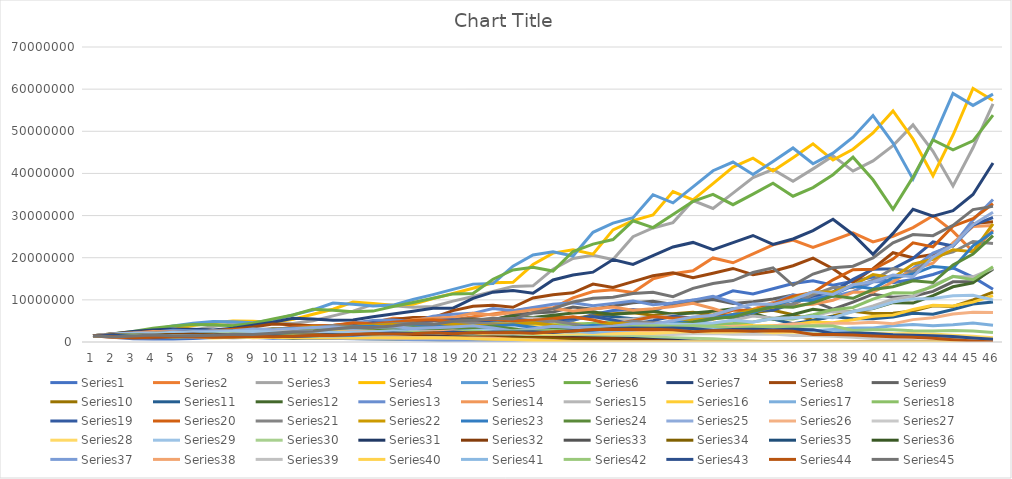
| Category | Series 0 | Series 1 | Series 2 | Series 3 | Series 4 | Series 5 | Series 6 | Series 7 | Series 8 | Series 9 | Series 10 | Series 11 | Series 12 | Series 13 | Series 14 | Series 15 | Series 16 | Series 17 | Series 18 | Series 19 | Series 20 | Series 21 | Series 22 | Series 23 | Series 24 | Series 25 | Series 26 | Series 27 | Series 28 | Series 29 | Series 30 | Series 31 | Series 32 | Series 33 | Series 34 | Series 35 | Series 36 | Series 37 | Series 38 | Series 39 | Series 40 | Series 41 | Series 42 | Series 43 | Series 44 |
|---|---|---|---|---|---|---|---|---|---|---|---|---|---|---|---|---|---|---|---|---|---|---|---|---|---|---|---|---|---|---|---|---|---|---|---|---|---|---|---|---|---|---|---|---|---|
| 0 | 1500000 | 1500000 | 1500000 | 1500000 | 1500000 | 1500000 | 1500000 | 1500000 | 1500000 | 1500000 | 1500000 | 1500000 | 1500000 | 1500000 | 1500000 | 1500000 | 1500000 | 1500000 | 1500000 | 1500000 | 1500000 | 1500000 | 1500000 | 1500000 | 1500000 | 1500000 | 1500000 | 1500000 | 1500000 | 1500000 | 1500000 | 1500000 | 1500000 | 1500000 | 1500000 | 1500000 | 1500000 | 1500000 | 1500000 | 1500000 | 1500000 | 1500000 | 1500000 | 1500000 | 1500000 |
| 1 | 1134576 | 1059408 | 1413792 | 1538352 | 1732752 | 1948752 | 1891152 | 1949904 | 1715184 | 1588464 | 1442304 | 1383696 | 1679328 | 1798272 | 1718928 | 1773072 | 1405296 | 1390032 | 1495440 | 1677600 | 1622736 | 1617408 | 1598256 | 1466928 | 1884384 | 1663776 | 1503792 | 1378080 | 1849968 | 1567584 | 1514448 | 1713168 | 1365552 | 1611648 | 1596240 | 1518336 | 1344816 | 1557504 | 1553904 | 1327248 | 1532160 | 1567872 | 1598256 | 1269648 | 1184688 |
| 2 | 794508.387 | 987287.105 | 1449584.234 | 1776388.918 | 2261662.356 | 2479684.665 | 2476535.729 | 2252513.849 | 1826694.554 | 1530477.456 | 1325306.334 | 1536051.606 | 2017744.064 | 2073802.851 | 2040958.206 | 1666823.842 | 1290280.17 | 1376446.944 | 1672966.006 | 1822139.791 | 1749967.989 | 1727049.266 | 1566522.589 | 1840861.535 | 2108086.916 | 1673867.708 | 1379790.25 | 1691233.685 | 1947899.026 | 1584606.081 | 1729592.481 | 1567017.136 | 1460341.336 | 1719151.204 | 1618808.615 | 1360250.523 | 1387857.559 | 1613190.749 | 1373910.508 | 1344624.73 | 1600083.429 | 1671407.992 | 1353012.157 | 989720.537 | 1401017.204 |
| 3 | 731928.376 | 1000209.173 | 1673453.928 | 2317818.884 | 2888597.417 | 3272597.959 | 2877176.102 | 2420747.775 | 1769876.652 | 1409596.472 | 1463986.809 | 1830147.983 | 2331441.271 | 2476678.746 | 1926809.735 | 1537117.374 | 1263199.189 | 1529016.345 | 1817581.082 | 1973149.612 | 1868823.93 | 1696319.77 | 1970548.273 | 2057585.835 | 2138039.289 | 1541647.755 | 1690784.846 | 1773300.256 | 1983936.333 | 1812007.674 | 1581975.948 | 1685006.137 | 1550592.718 | 1747584.272 | 1453166.883 | 1402540.621 | 1428253.316 | 1426063.673 | 1390582.86 | 1391917.285 | 1704207.187 | 1415672.224 | 1054917.65 | 1147894.731 | 1642870.576 |
| 4 | 732278.317 | 1140017.458 | 2182991.184 | 2959507.087 | 3824133.077 | 3824616.197 | 3107428.082 | 2366091.785 | 1640429.284 | 1561699.374 | 1735647.634 | 2099082.258 | 2789324.759 | 2350966.008 | 1786447.627 | 1513033.61 | 1386356.218 | 1650159.668 | 1968742.399 | 2115736.072 | 1835791.76 | 2138591.033 | 2206859.983 | 2085103.514 | 1986028.237 | 1897475.205 | 1770546.885 | 1798545.884 | 2286351.073 | 1659281.783 | 1701011.386 | 1798816.138 | 1569049.318 | 1572680.535 | 1501949.845 | 1442005.836 | 1253920.593 | 1443029.835 | 1438017.564 | 1468976.07 | 1442101.117 | 1104563.443 | 1223884.403 | 1321175.211 | 1500392.893 |
| 5 | 823291.224 | 1469507.211 | 2786824.661 | 3917113.781 | 4479676.461 | 4151864.04 | 3051690.005 | 2214554.063 | 1831965.663 | 1857005.448 | 1981899.664 | 2494332.524 | 2652135.977 | 2194682.47 | 1770069.844 | 1670185.637 | 1478907.695 | 1775099.474 | 2111565.254 | 2086583.548 | 2314720.646 | 2399423.1 | 2240471.214 | 1935181.665 | 2468602.876 | 1994481.839 | 1793430.266 | 2063774.169 | 2108504.869 | 1786518.257 | 1815819.017 | 1829986.154 | 1405210.522 | 1630323.188 | 1548145.318 | 1264711.854 | 1257809.365 | 1491873.169 | 1515996.113 | 1231165.793 | 1123726.108 | 1282867.973 | 1409055.369 | 1184991.941 | 1496612.819 |
| 6 | 1047426.927 | 1858057.316 | 3687976.111 | 4587807.597 | 4872748.766 | 4097170.425 | 2871146.199 | 2503154.594 | 2195727.108 | 2126117.803 | 2345427.511 | 2356611.036 | 2480942.408 | 2192627.745 | 1967529.616 | 1791687.9 | 1571473.734 | 1890986.01 | 2083001.658 | 2641956.31 | 2597302.884 | 2440102.648 | 2083376.771 | 2403022.354 | 2616410.052 | 2027895.648 | 2055150.047 | 1895807.469 | 2288575.698 | 1909586.415 | 1847199.971 | 1648178.675 | 1448311.324 | 1685744.391 | 1361520.003 | 1266988.89 | 1288006.366 | 1572350.467 | 1269125.777 | 946529.586 | 1302570.562 | 1478521.387 | 1264184.787 | 1155190.612 | 1598985.153 |
| 7 | 1310156.705 | 2439156.728 | 4318924.885 | 4989635.022 | 4817642.689 | 3875116.406 | 3265911.755 | 3035774.071 | 2531628.424 | 2522321.084 | 2207324.202 | 2187025.472 | 2484742.186 | 2458260.961 | 2124708.304 | 1915190.834 | 1653585.835 | 1853064.931 | 2638128.43 | 2974554.118 | 2641591.104 | 2273039.288 | 2592730.407 | 2544798.327 | 2682172.245 | 2332896.437 | 1885581.886 | 2048579.887 | 2465401.835 | 1945085.645 | 1663603.172 | 1710247.783 | 1488423.768 | 1487508.591 | 1368745.795 | 1295543.853 | 1343763.993 | 1315928.753 | 974134.943 | 1074677.761 | 1498360.969 | 1327887.164 | 1232860.905 | 1200249.833 | 1837116.249 |
| 8 | 1704107.847 | 2839060.946 | 4696726.24 | 4932527.346 | 4565839.1 | 4435891.098 | 3984945.686 | 3536205.57 | 3022869.654 | 2379368.097 | 2038426.47 | 2169491.742 | 2792834.698 | 2676199.24 | 2287028.464 | 2027398.661 | 1600680.451 | 2330490.552 | 2970888.037 | 3034786.65 | 2460979.549 | 2834480.165 | 2750734.027 | 2606641.798 | 3111511.904 | 2148003.17 | 2034689.17 | 2197415.557 | 2530446.295 | 1754121.993 | 1726155.476 | 1770186.926 | 1304816.99 | 1501775.655 | 1405005.964 | 1349543.087 | 1112431.666 | 1009650.569 | 1103215.254 | 1210898.483 | 1343171.36 | 1296726.486 | 1281557.526 | 1334757.954 | 1776543.518 |
| 9 | 1969458.961 | 3071239.672 | 4642529.715 | 4674024.664 | 5239286.091 | 5445050.545 | 4665967.861 | 4261718.214 | 2868922.417 | 2203836.785 | 2009966.954 | 2414439.034 | 3047618.262 | 2904835.21 | 2437866.741 | 1974378.239 | 1986632.268 | 2609506.562 | 3031652.486 | 2836540.45 | 3069191.422 | 3012268.28 | 2822655.389 | 3021405.921 | 2886543.778 | 2327237.305 | 2179563.852 | 2245996.44 | 2300159.703 | 1822993.428 | 1786546.219 | 1563714.157 | 1306388.484 | 1548758.162 | 1469634.096 | 1115345.233 | 840210.38 | 1142709.595 | 1239830.204 | 1063070.907 | 1308453.58 | 1350201.602 | 1425991.771 | 1247031.036 | 2066432.898 |
| 10 | 2117388.207 | 3020799.477 | 4398774.294 | 5362480.862 | 6445917.945 | 6407957.174 | 5649351.298 | 4079559.202 | 2677613.079 | 2180976.682 | 2222810.609 | 2610322.444 | 3315979.689 | 3121925.187 | 2390454.44 | 2466497.417 | 2200249.025 | 2648814.161 | 2834198.597 | 3550671.606 | 3262009.812 | 3096108.81 | 3277746.752 | 2800896.7 | 3154026.5 | 2502696.11 | 2224802.517 | 2032791.955 | 2412837.232 | 1889933.831 | 1578065.848 | 1580872.834 | 1334949.844 | 1628036.428 | 1220047.78 | 840346.453 | 927244.555 | 1283377.442 | 1085557.611 | 1007253.046 | 1358275.007 | 1505392.791 | 1333099.789 | 1390757.223 | 2403728.552 |
| 11 | 2070366.16 | 2846864.509 | 5046072.256 | 6596391.967 | 7600349.012 | 7793273.344 | 5430789.992 | 3848101.439 | 2674394.648 | 2421182.771 | 2388722.734 | 2813110.502 | 3572156.63 | 3085782.384 | 3008310.427 | 2746623.903 | 2210448.325 | 2462663.26 | 3548569.82 | 3785290.733 | 3353111.053 | 3601242.503 | 3043459.957 | 3057931.831 | 3419407.147 | 2564394.853 | 2010835.52 | 2121604.982 | 2525653.441 | 1672358.129 | 1595255.198 | 1632760.125 | 1389603.341 | 1358742.615 | 925260.726 | 923660.193 | 1014078.596 | 1122927.05 | 1024797.782 | 1008857.299 | 1508863.571 | 1410410.544 | 1487921.941 | 1552240.16 | 2520993.129 |
| 12 | 1938579.205 | 3244865.379 | 6206467.558 | 7776694.249 | 9258993.05 | 7522192.878 | 5149094.992 | 3892102.505 | 2997571.421 | 2611433.122 | 2558131.709 | 3002198.633 | 3538790.722 | 3916254.851 | 3370288.835 | 2773630.33 | 2032750.533 | 3064143.712 | 3783778.871 | 3902604.195 | 3900537.205 | 3348753.373 | 3328781.627 | 3312647.005 | 3531182.925 | 2326960.426 | 2095281.842 | 2209254.904 | 2257597.519 | 1694360.301 | 1647472.115 | 1719039.412 | 1147565.372 | 1038361.371 | 1027922.338 | 1005744.256 | 862533.185 | 1059092.705 | 1021415.508 | 1071433.249 | 1408030.544 | 1578569.317 | 1662031.841 | 1562926.006 | 3071998.71 |
| 13 | 2192335.38 | 3966913.663 | 7316299.883 | 9472671.334 | 8950463.106 | 7166963.725 | 5239303.688 | 4418595.884 | 3262487.639 | 2807382.127 | 2713054.748 | 2947233.995 | 4501790.849 | 4417600.599 | 3422771.031 | 2564710.303 | 2497497.255 | 3250343.019 | 3901774.936 | 4553307.198 | 3627362.901 | 3668700.505 | 3612255.055 | 3418383.899 | 3230033.549 | 2435988.02 | 2178170.749 | 1964054.463 | 2316195.64 | 1754073.712 | 1734370.751 | 1437098.333 | 863640.612 | 1167835.06 | 1132242.937 | 851333.875 | 781419.443 | 1054282.038 | 1077801.927 | 949473.205 | 1567959.737 | 1768266.18 | 1674864.92 | 1821997.125 | 3479330.448 |
| 14 | 2660131.01 | 4652458.789 | 8911124.125 | 9156020.762 | 8543267.888 | 7333745.289 | 5983774.194 | 4866181.731 | 3540282.958 | 2988790.304 | 2646998.946 | 3713582.012 | 5087727.304 | 4514893.759 | 3183899.399 | 3171245.084 | 2621219.847 | 3334791.503 | 4553190.434 | 4245608.693 | 3974293.174 | 3987284.134 | 3733682.89 | 3124479.648 | 3412977.755 | 2544563.311 | 1932991.1 | 2001521.803 | 2430210.875 | 1851315.054 | 1449774.613 | 1100874.829 | 947483.427 | 1303102.483 | 970542.54 | 765795.169 | 734902.219 | 1110646.148 | 947667.397 | 985982.461 | 1747327.121 | 1787066.933 | 1954330.198 | 1981871.262 | 3417244.161 |
| 15 | 3099952.258 | 5641173.821 | 8612594.826 | 8738331.118 | 8760250.731 | 8422559.892 | 6625765.841 | 5344069.55 | 3803890.816 | 2927051.046 | 3313369.929 | 4164618.321 | 5208832.81 | 4227559.866 | 3963906.024 | 3346392.772 | 2661113.942 | 3871825.775 | 4246199.591 | 4665306.67 | 4319787.148 | 4127402.284 | 3418382.864 | 3298559.638 | 3599067.881 | 2269556.993 | 1965522.102 | 2085092.374 | 2600794.171 | 1551726.48 | 1110431.757 | 1242851.396 | 1029571.681 | 1132484.674 | 889271.863 | 712569.813 | 714112.416 | 974569.815 | 972995.019 | 1017073.397 | 1756572.359 | 2092052.106 | 2127719.477 | 1870009.751 | 3800679.18 |
| 16 | 3737379.098 | 5430079.906 | 8218953.227 | 8958929.321 | 10081343.223 | 9372822.188 | 7315902.692 | 5808457.832 | 3758924.305 | 3678764.072 | 3695764.337 | 4233440.06 | 4886096.458 | 5302626.676 | 4206877.228 | 3415673.164 | 3056598.805 | 3594556.548 | 4666806.339 | 5084845.534 | 4471957.674 | 3784516.008 | 3615785.338 | 3475338.158 | 3241705.496 | 2322237.66 | 2042749.382 | 2215113.592 | 2211727.828 | 1193107.675 | 1253366.886 | 1392268.389 | 869526.977 | 1058129.6 | 850277.899 | 681107.28 | 561870.42 | 997645.491 | 990028.75 | 937805.811 | 2044063.054 | 2284688.99 | 2009481.246 | 1985714.605 | 4438196.28 |
| 17 | 3578878.388 | 5156635.683 | 8425569.64 | 10308477.208 | 11239078.36 | 10400094.21 | 7992415.3 | 5803330.997 | 4769325.417 | 4116988.04 | 3737898.121 | 3941858.945 | 6140976.81 | 5662436.816 | 4318286.092 | 3945031.072 | 2810383.176 | 3930909.884 | 5087348.858 | 5277736.531 | 4100789.101 | 4009936.466 | 3816969.789 | 3127428.581 | 3356862.245 | 2429657.235 | 2164804.653 | 1869451.932 | 1735246.886 | 1354867.961 | 1403731.507 | 1214959.586 | 779513.918 | 1039960.37 | 846860.608 | 522693.525 | 477634.153 | 1011420.265 | 897592.943 | 979228.428 | 2219614.931 | 2164573.132 | 2136191.894 | 2210921.572 | 4158961.212 |
| 18 | 3377264.999 | 5256665.143 | 9693794.556 | 11490805.162 | 12493019.19 | 11414243.383 | 8023890.375 | 7447669.677 | 5378758.887 | 4176907.821 | 3462021.078 | 4913039.427 | 6568498.29 | 5847361.497 | 5016173.049 | 3645408.427 | 3040007.836 | 4265009.642 | 5281188.614 | 4852485.976 | 4345462.422 | 4240364.879 | 3441691.951 | 3234984.209 | 3556432.447 | 2592671.37 | 1822300.582 | 1451354.689 | 2032116.368 | 1526866.757 | 1224675.073 | 1141689.95 | 721618.803 | 1076874.26 | 690429.469 | 422140.572 | 362704.131 | 912799.435 | 915190.55 | 947141.779 | 2090622.95 | 2309822.145 | 2381317.402 | 1977190.846 | 4937639.674 |
| 19 | 3417586.932 | 6014587.878 | 10804652.276 | 12771210.708 | 13733892.108 | 11508488.846 | 10348032.564 | 8475988.87 | 5496168.364 | 3881325.458 | 4288863.139 | 5219033.436 | 6793829.959 | 6833328.537 | 4658997.139 | 3965636.526 | 3264148.336 | 4407738.677 | 4856451.291 | 5157521.744 | 4595611.698 | 3830193.618 | 3568604.756 | 3423424.919 | 3843569.695 | 2198232.901 | 1409668.076 | 1672917.498 | 2360859.969 | 1340702.813 | 1150445.714 | 1130874.18 | 684197.747 | 924798.813 | 627427.646 | 287271.164 | 188935.368 | 924547.833 | 859726.215 | 778651.95 | 2215224.367 | 2585374.114 | 2132197.28 | 2217227.568 | 5144912.735 |
| 20 | 3881835.932 | 6670842.24 | 12007547.147 | 14038060.268 | 13868471.891 | 14906408.897 | 11822259.847 | 8733056.64 | 5145366.643 | 4826401.748 | 4532940.073 | 5362117.794 | 7951983.158 | 6380604.075 | 5097445.95 | 4281248.422 | 3339582.573 | 4034919.278 | 5162693.111 | 5470889.553 | 4151481.879 | 3979842.683 | 3785864.481 | 3695621.742 | 3301394.998 | 1717582.083 | 1615926.156 | 1913768.794 | 2136961.505 | 1270613.973 | 1139044.49 | 1183461.094 | 518462.308 | 916361.167 | 537229.273 | 99021.684 | 0 | 861242.421 | 678860.153 | 679506.181 | 2460754.478 | 2324557.74 | 2394834.362 | 2188399.959 | 5640957.613 |
| 21 | 4277001.175 | 7377662.015 | 13197568.464 | 14174074.659 | 17990761.425 | 17087626.216 | 12223155.191 | 8245389.886 | 6452396.248 | 5117127.373 | 4634069.399 | 6234406.484 | 7435488.211 | 7022354.748 | 5533252.033 | 4403355.755 | 3025645.546 | 4267200.163 | 5477388.027 | 4957310.849 | 4314188.299 | 4231349.423 | 4097044.393 | 3170676.933 | 2625407.462 | 1999105.21 | 1838453.943 | 1706164.482 | 2107804.376 | 1273046.209 | 1191305.213 | 1029979.643 | 407349.928 | 891219.553 | 372253.988 | 0 | 0 | 671847.352 | 551370.138 | 579720.461 | 2195362.331 | 2624781.345 | 2367447.955 | 2262664.742 | 5433835.659 |
| 22 | 4699174.187 | 8072210.366 | 13324433.938 | 18385192.455 | 20647834.584 | 17720509.457 | 11581235.708 | 10438197.133 | 6888965.978 | 5247501.314 | 5360833.962 | 5795200.436 | 8195888.405 | 7665093.806 | 5720949.156 | 4011204.347 | 3161616.494 | 4503858.576 | 4964127.468 | 5170472.842 | 4587375.217 | 4589097.455 | 3523895.16 | 2517583.486 | 3135942.707 | 2308780.512 | 1630012.261 | 1650190.523 | 2221877.983 | 1352576.609 | 1036040.401 | 1041586.955 | 259245.176 | 761276.175 | 211010.672 | 0 | 0 | 533109.638 | 410439.025 | 355728.089 | 2454319.295 | 2608519.178 | 2452229.685 | 2052255.121 | 6976187.387 |
| 23 | 5109740.933 | 8115585.98 | 17281816.346 | 21098734.602 | 21435266.909 | 16841003.069 | 14717995.866 | 11230648.648 | 7112689.684 | 6089538.751 | 4960811.66 | 6346325.849 | 8958841.165 | 7966908.234 | 5239406.246 | 4218195.005 | 3296307.615 | 4060336.944 | 5178736.112 | 5518505.212 | 4975818.372 | 3955721.879 | 2807434.049 | 3000499.967 | 3711622.677 | 2077787.717 | 1565083.611 | 1697627.531 | 2513553.148 | 1199221.245 | 1046552.478 | 1040045.459 | 58887.517 | 707600.474 | 0 | 0 | 0 | 377126.431 | 179857.963 | 164417.716 | 2414906.205 | 2718194.156 | 2228577.525 | 2454144.092 | 7883871.619 |
| 24 | 5107327.088 | 10481437.429 | 19831345.846 | 21901713.702 | 20393025.638 | 21473563.197 | 15884705.391 | 11681522.895 | 8310549.274 | 5650959.005 | 5405332.795 | 6894805.871 | 9324160.704 | 7335214.988 | 5543882.256 | 4426680.629 | 2934261.638 | 4209175.53 | 5528580.581 | 6008024.045 | 4289581.463 | 3160608.36 | 3362102.545 | 3544052.107 | 3419548.155 | 2034368.047 | 1595116.129 | 1865195.028 | 2391919.726 | 1246239.152 | 1043536.201 | 920499.066 | 0 | 583543.418 | 0 | 0 | 0 | 138124.18 | 0 | 0 | 2487973.423 | 2486313.445 | 2671602.474 | 2605194.325 | 9474599.753 |
| 25 | 6557211.425 | 11988204.58 | 20585017.781 | 20835221.701 | 26032708.974 | 23237398.754 | 16571359.925 | 13749160.607 | 7758753.285 | 6176690.166 | 5844547.739 | 7134511.956 | 8596480.4 | 7808694.536 | 5854383.539 | 3967315.906 | 2995055.851 | 4464462.541 | 6020341.885 | 5198618.218 | 3427904.683 | 3800736.073 | 3988840.841 | 3258913.983 | 3447940.192 | 2125167.912 | 1732327.02 | 1719450.282 | 2729244.769 | 1286648.622 | 921891.751 | 905604.445 | 0 | 369160.404 | 0 | 0 | 0 | 0 | 0 | 0 | 2247838.455 | 3004675.073 | 2842644.897 | 2943077.333 | 10394961.108 |
| 26 | 7465055.368 | 12407287.305 | 19581619.609 | 26595015.14 | 28196943.373 | 24302798.379 | 19561072.363 | 12918665.192 | 8537657.233 | 6698538.569 | 6020194.179 | 6539404.909 | 9165413.054 | 8296246.817 | 5280665.837 | 4083461.012 | 3125479.342 | 4830370.621 | 5210436.356 | 4174671.862 | 4123098.359 | 4526323.088 | 3683160.825 | 3278282.299 | 3730653.517 | 2378664.138 | 1576051.585 | 1884864.143 | 3116638.305 | 1187615.702 | 904423.066 | 811742.46 | 0 | 159617.123 | 0 | 0 | 0 | 0 | 0 | 0 | 2674810.118 | 3221085.268 | 3219174.297 | 3051164.975 | 10641746.158 |
| 27 | 7693766.105 | 11767712.132 | 24993443.202 | 28804119.971 | 29515280.141 | 28757576.429 | 18425642.482 | 14315590.013 | 9317600.245 | 6919619.005 | 5492424.466 | 6926003.548 | 9752514.674 | 7529443.467 | 5477732.875 | 4299046.527 | 3326284.342 | 4153726.184 | 4185386.838 | 5056079.136 | 4911235 | 4194116.186 | 3723842.276 | 3537450.666 | 4347300.701 | 2237983.045 | 1697683.04 | 2066253.532 | 3211021.948 | 1241868.665 | 807554.543 | 596976.511 | 0 | 0 | 0 | 0 | 0 | 0 | 0 | 0 | 2826222.702 | 3676239.084 | 3345309.587 | 2950693.03 | 11517157.124 |
| 28 | 7266345.929 | 14971714.041 | 27068292.711 | 30148995.939 | 34954897.131 | 27145406.122 | 20473671.614 | 15725407.3 | 9683022.238 | 6331463.806 | 5786068.118 | 7320907.699 | 8864688.997 | 7868125.846 | 5813786.652 | 4616732.355 | 2812433.984 | 3308246.659 | 5071139.873 | 6060261.034 | 4551640.028 | 4258441.57 | 4041832.091 | 4109769.861 | 4264295.718 | 2518072.868 | 1826169.917 | 2041720.673 | 3839676.569 | 1203251.538 | 590195.392 | 417534.65 | 0 | 0 | 0 | 0 | 0 | 0 | 0 | 0 | 3177067.66 | 3848919.841 | 3243289.934 | 3000661.321 | 11775237.674 |
| 29 | 9201873.534 | 16173015.922 | 28330918.925 | 35703281.581 | 33019123.881 | 30231300.28 | 22546296.824 | 16442282.444 | 8913907.39 | 6692461.949 | 6082978.822 | 6609910.731 | 9280278.807 | 8413985.016 | 6294423.041 | 3940020.877 | 2189077.673 | 3960207.75 | 6080557.016 | 5648771.003 | 4622503.698 | 4644571.664 | 4726192.727 | 4019225.56 | 5042597.635 | 2835782.711 | 1767740.632 | 2328928.67 | 4276356.347 | 991476.788 | 406710.018 | 205142.552 | 0 | 0 | 0 | 0 | 0 | 0 | 0 | 0 | 3277928.954 | 3760943.5 | 3307817.404 | 2877083.949 | 10758971.033 |
| 30 | 9903149.865 | 16886449.066 | 33548881.762 | 33724342.194 | 36801339.936 | 33361092.644 | 23629064.659 | 15228997.731 | 9487657.935 | 7059912.499 | 5461863.375 | 6864619.857 | 9942414.12 | 9177791.891 | 5416272.257 | 3106172.659 | 2533179.206 | 4696639.17 | 5669595.497 | 5776143.522 | 5042957.21 | 5459827.608 | 4651813.163 | 4736526.568 | 5956108.355 | 2881510.957 | 1966914.819 | 2480266.995 | 4132230.74 | 868576.425 | 188740.008 | 0 | 0 | 0 | 0 | 0 | 0 | 0 | 0 | 0 | 3153708.867 | 3870380.995 | 3181708.402 | 2452262.961 | 12721162.821 |
| 31 | 10303391.716 | 19949508.599 | 31688234.911 | 37585273.731 | 40640144.459 | 35030701.607 | 21936022.169 | 16321174.857 | 10078315.117 | 6361261.911 | 5634485.95 | 7294555.343 | 10864591.202 | 7956352.872 | 4317608.61 | 3663643.912 | 2909107.809 | 4335171.781 | 5799756.288 | 6350570.801 | 5929816.168 | 5401904.136 | 5522215.78 | 5577040.082 | 6336431.279 | 3393789.928 | 2042380.451 | 2288596.174 | 4512449.368 | 745910.785 | 0 | 0 | 0 | 0 | 0 | 0 | 0 | 0 | 0 | 0 | 3187901.209 | 3759181.472 | 2721887.92 | 2660932.272 | 13886604.197 |
| 32 | 12130177.043 | 18804946.544 | 35314718.939 | 41503771.923 | 42702026.111 | 32582657.094 | 23569884.578 | 17455604.003 | 9145221.243 | 6590173.83 | 5945995.018 | 7907110.567 | 9435502.993 | 6405068.035 | 5175011.039 | 4285355.677 | 2603522.125 | 4381156.792 | 6379396.178 | 7529956.299 | 5868524.21 | 6450263.127 | 6545664.82 | 5916002.636 | 7835264.427 | 3727432.111 | 1832431.495 | 2364013.965 | 5173724.351 | 463571.273 | 0 | 0 | 0 | 0 | 0 | 0 | 0 | 0 | 0 | 0 | 3036370.713 | 3251652.633 | 2967960.303 | 2674399.486 | 14579826.422 |
| 33 | 11399983.148 | 20911272.282 | 38995144.062 | 43607452.642 | 39743524.035 | 35083673.505 | 25271852.71 | 15947787.681 | 9554625.066 | 6985190.282 | 6400668.263 | 6812185.038 | 7613570.479 | 7784331.444 | 6144454.838 | 3904388.661 | 2530813.885 | 4752905.206 | 7567761.176 | 7512537.443 | 7009602.374 | 7686113.361 | 6986166.549 | 7293925.628 | 8986950.251 | 3551990.337 | 1824561.345 | 2552673.327 | 4764321.558 | 226582.903 | 0 | 0 | 0 | 0 | 0 | 0 | 0 | 0 | 0 | 0 | 2568063.516 | 3597221.81 | 2998192.602 | 2574887.371 | 16480401.16 |
| 34 | 12635715.63 | 23044501.368 | 40970358.223 | 40584373.457 | 42824840.497 | 37694705.981 | 23146768.925 | 16796122.478 | 10215359.182 | 7552641.788 | 5475794.099 | 5439090.372 | 9283194.329 | 9359392.933 | 5677664.734 | 3882983.575 | 2620159.05 | 5554623.269 | 7553727.068 | 9053969.551 | 8354928.679 | 8242719.555 | 8666878.2 | 8345102.24 | 8932152.94 | 3816519.059 | 1885940.366 | 2209716.507 | 5540957.366 | 0 | 0 | 0 | 0 | 0 | 0 | 0 | 0 | 0 | 0 | 0 | 2757658.363 | 3687883.609 | 2903347.691 | 2647145.39 | 17581523.643 |
| 35 | 13883162.722 | 24167053.101 | 38128892.908 | 43728675.155 | 46044010.285 | 34595402.729 | 24449417.809 | 18103708.1 | 11140411.135 | 6490283.584 | 4331185.089 | 6534149.953 | 11193863.186 | 8748552.843 | 5745388.229 | 4133940.146 | 2901237.516 | 5464253.391 | 9108210.945 | 10877823.851 | 8962205.313 | 10274804.316 | 9968304.09 | 8274862.264 | 10064285.346 | 4303086.69 | 1552655.679 | 2372632.713 | 5665485.171 | 0 | 0 | 0 | 0 | 0 | 0 | 0 | 0 | 0 | 0 | 0 | 2741184.074 | 3630280.988 | 3005427.314 | 2564356.809 | 13457279.851 |
| 36 | 14519044.906 | 22450020.518 | 41081518.64 | 47013483.332 | 42287183.081 | 36628919.214 | 26429763.639 | 19899696.877 | 9655816.964 | 5164556.332 | 5133230.52 | 7774474.601 | 10490680.878 | 8975811.687 | 6242265.99 | 4730507.42 | 2697736.709 | 6482706.546 | 10947860.222 | 11751939.411 | 11174441.345 | 11865403.905 | 9932947.186 | 9300149.859 | 11901314.072 | 3897605.62 | 1548158.204 | 2237319.063 | 6090505.396 | 0 | 0 | 0 | 0 | 0 | 0 | 0 | 0 | 0 | 0 | 0 | 2605746.904 | 3830300.514 | 2933766.206 | 1766437.616 | 16125785.949 |
| 37 | 13450427.639 | 24139597.706 | 44165978.308 | 43175472.301 | 44808363.197 | 39688835.757 | 29133572.132 | 17382259.227 | 7771117.403 | 6174370.008 | 6031665.922 | 7197808.552 | 10796403.991 | 9905488.098 | 7307233.331 | 4555674.933 | 2990529.193 | 7679905.867 | 11832282.403 | 14756346.603 | 12906996.614 | 11867314.671 | 11222840.456 | 10971076.574 | 11283117.685 | 4442020.171 | 1336655.168 | 2189546.066 | 5753994.111 | 0 | 0 | 0 | 0 | 0 | 0 | 0 | 0 | 0 | 0 | 0 | 2637650.876 | 3816886.829 | 2039502.802 | 1804310.802 | 17595581.957 |
| 38 | 14418352.451 | 25900957.8 | 40559071.514 | 45747059.126 | 48589694.073 | 43847743.426 | 25517682.414 | 14131163.951 | 9441044.159 | 7313853.672 | 5519253.757 | 7300784.612 | 11955537.134 | 11791971.012 | 7200031.236 | 5273271.73 | 3317025.795 | 8192588.337 | 14862993.008 | 17144461.834 | 12911541.829 | 13461761.792 | 13306310.793 | 10378136.394 | 13575259.943 | 4454902.559 | 1155408.495 | 1863780.025 | 7227087.092 | 0 | 0 | 0 | 0 | 0 | 0 | 0 | 0 | 0 | 0 | 0 | 2510481.276 | 2717832.96 | 2116110.14 | 1674795.955 | 17988760.529 |
| 39 | 15423988.938 | 23739521.35 | 42973159.629 | 49604869.141 | 53721626.301 | 38489418.854 | 20817871.508 | 17408367.011 | 11347562.989 | 6743496.962 | 5518608.589 | 7953548.588 | 14284017.739 | 11809602.524 | 8557703.613 | 6105739.457 | 3318407.111 | 10158362.627 | 17273905.344 | 17242477.482 | 14649267.74 | 16021074.422 | 12645427.564 | 12455078.986 | 14313356.206 | 4689722.808 | 824182.731 | 2044721.437 | 8018244.924 | 0 | 0 | 0 | 0 | 0 | 0 | 0 | 0 | 0 | 0 | 0 | 1692114.588 | 2932720.517 | 2000510.645 | 1423600.836 | 19935452.565 |
| 40 | 14094813.856 | 25095875.067 | 46595267.375 | 54841129.381 | 47190852.395 | 31487907.336 | 25768316.684 | 21182113.767 | 10603782.453 | 6805865.754 | 5912888.325 | 9337849.122 | 14354557.753 | 14292214.108 | 10154979.279 | 6375546.53 | 3840110.596 | 11678718.551 | 17377714.794 | 19674202.73 | 17437694.834 | 15277365.311 | 15255503.96 | 13103291.281 | 15882065.875 | 4336213.872 | 648432.849 | 1986513.274 | 9469623.111 | 0 | 0 | 0 | 0 | 0 | 0 | 0 | 0 | 0 | 0 | 0 | 1662616.496 | 2895100.056 | 1742353.913 | 1253285.472 | 23515562.537 |
| 41 | 14848463.499 | 27150455.21 | 51511952.445 | 48171811.754 | 38642049.413 | 39122058.782 | 31484036.289 | 20012583.676 | 10875374.421 | 7371902.496 | 6815349.757 | 9227410.108 | 17437084.641 | 17234242.279 | 10849334.815 | 7733425.043 | 4147720.357 | 11632655.641 | 19834585.2 | 23543937.989 | 16631107.934 | 18501220.74 | 16123019.597 | 14507259.276 | 15474637.725 | 5309806.568 | 351158.79 | 2025496.25 | 10231872.365 | 0 | 0 | 0 | 0 | 0 | 0 | 0 | 0 | 0 | 0 | 0 | 1470658.8 | 2660417.112 | 1590529.243 | 1122983.496 | 25508434.121 |
| 42 | 16008609.477 | 29951184.105 | 45245906.519 | 39442756.905 | 48070095.372 | 47954077.199 | 29854274.348 | 20790655.806 | 11997047.418 | 8600698.467 | 6612254.186 | 11002997.693 | 21094890.601 | 18679658.288 | 13473101.414 | 8723587.331 | 3885007.134 | 13137646.899 | 23742650.072 | 22562330.508 | 20144528.683 | 19618320.93 | 17932255.011 | 14105541.507 | 20116267.399 | 5761074.301 | 0 | 1879618.8 | 10321495.021 | 0 | 0 | 0 | 0 | 0 | 0 | 0 | 0 | 0 | 0 | 0 | 1166275.7 | 2611858.116 | 1503257.899 | 881931.208 | 25235156.063 |
| 43 | 17601204.814 | 26253514.173 | 37045386.429 | 49061912.511 | 58984540.346 | 45600339.161 | 31145245.916 | 23261972.528 | 14275870.629 | 8446496.71 | 7720765.801 | 13094907.258 | 22929599.14 | 23529697.034 | 15509523.405 | 8534920.194 | 4088751.038 | 15570245.012 | 22758564.722 | 27473929.944 | 21364429.142 | 21891674.093 | 17511056.571 | 18295055.55 | 22965841.895 | 6656112.056 | 0 | 1591038.351 | 10999671.087 | 0 | 0 | 0 | 0 | 0 | 0 | 0 | 0 | 0 | 0 | 0 | 913462.974 | 2712291.918 | 1277844.278 | 561974.947 | 27689343.588 |
| 44 | 15378332.656 | 21438725.039 | 46077112.066 | 60197095.336 | 56141200.196 | 47725932.957 | 35005766.591 | 28093137.644 | 14291500.008 | 10001613.509 | 9013396.71 | 14027476.189 | 28963536.66 | 27409286.892 | 15466763.144 | 9451984.672 | 4508491.305 | 14791435.123 | 27720692.43 | 29270955.184 | 23844062.87 | 21443476.921 | 22817960.967 | 20848507.949 | 27858785.317 | 7049501.045 | 0 | 1350459.659 | 11076988.876 | 0 | 0 | 0 | 0 | 0 | 0 | 0 | 0 | 0 | 0 | 0 | 662260.696 | 2593398.742 | 938326.745 | 263805.206 | 31423040.123 |
| 45 | 12506008.291 | 26571216.572 | 56531956.194 | 57291605.243 | 58819900.231 | 53827798.465 | 42472979.641 | 28517545.971 | 17288310.806 | 11828050.024 | 9485271.134 | 17466165.319 | 33816098.263 | 27631352.634 | 17490135.52 | 10990902.403 | 3991407.65 | 17837020.067 | 29540990.062 | 32815115.129 | 23359501.678 | 28034500.961 | 26100337.967 | 25248218.538 | 30810360.104 | 6970645.2 | 0 | 1013007.291 | 9964499.311 | 0 | 0 | 0 | 0 | 0 | 0 | 0 | 0 | 0 | 0 | 0 | 325516.989 | 2243535.495 | 659350.732 | 0 | 32181703.068 |